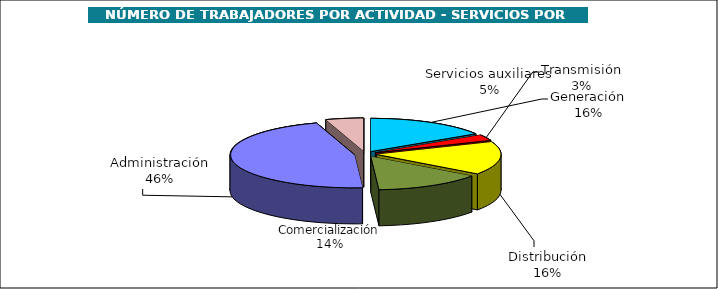
| Category | Series 0 |
|---|---|
| Generación | 16.008 |
| Transmisión | 2.914 |
| Distribución | 16.031 |
| Comercialización | 14.008 |
| Administración | 46.112 |
| Servicios auxiliares | 4.926 |